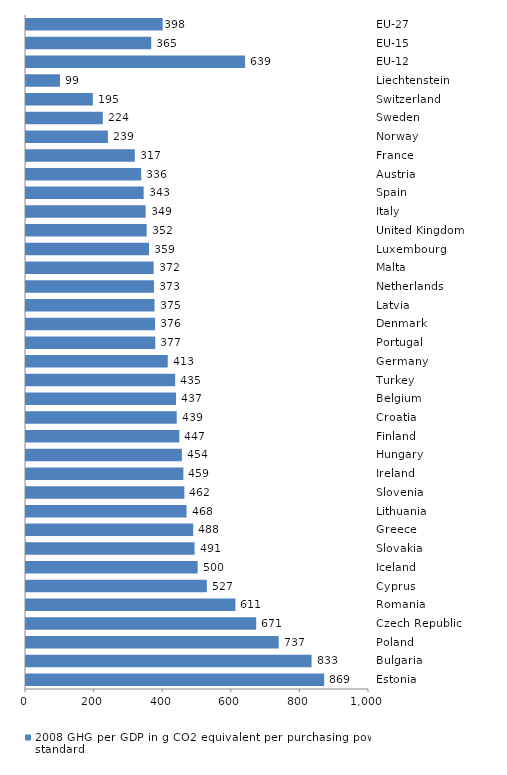
| Category | 2008 GHG per GDP in g CO2 equivalent per purchasing power standard |
|---|---|
| EU-27 | 398.397 |
| EU-15 | 365.102 |
| EU-12 | 638.769 |
| Liechtenstein | 99.065 |
| Switzerland | 194.87 |
| Sweden | 223.873 |
| Norway | 238.85 |
| France | 317.232 |
| Austria | 335.924 |
| Spain | 343.019 |
| Italy | 348.838 |
| United Kingdom | 351.693 |
| Luxembourg | 358.738 |
| Malta | 372.175 |
| Netherlands | 373.033 |
| Latvia | 374.74 |
| Denmark | 376.153 |
| Portugal | 376.812 |
| Germany | 413.207 |
| Turkey | 434.874 |
| Belgium | 437.254 |
| Croatia | 439.495 |
| Finland | 447.031 |
| Hungary | 454.422 |
| Ireland | 458.789 |
| Slovenia | 461.761 |
| Lithuania | 468.119 |
| Greece | 487.514 |
| Slovakia | 491.379 |
| Iceland | 500.472 |
| Cyprus | 527.204 |
| Romania | 610.581 |
| Czech Republic | 671.078 |
| Poland | 736.741 |
| Bulgaria | 832.577 |
| Estonia | 869.336 |